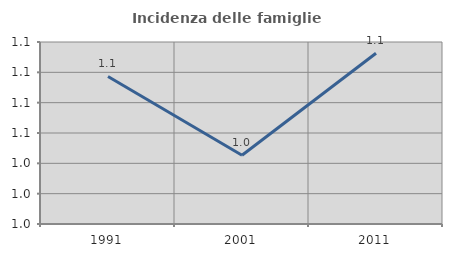
| Category | Incidenza delle famiglie numerose |
|---|---|
| 1991.0 | 1.097 |
| 2001.0 | 1.045 |
| 2011.0 | 1.113 |